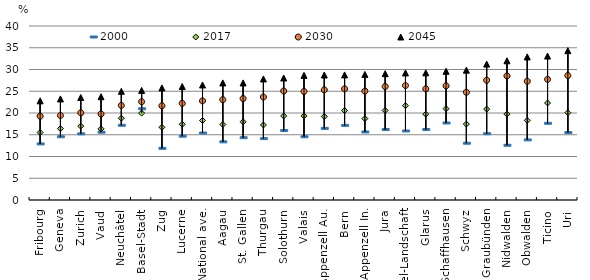
| Category | 2000 | 2017 | 2030 | 2045 |
|---|---|---|---|---|
| Fribourg | 12.892 | 15.514 | 19.264 | 22.798 |
| Geneva | 14.536 | 16.413 | 19.419 | 23.24 |
| Zurich | 15.208 | 16.976 | 20.043 | 23.568 |
| Vaud | 15.588 | 16.363 | 19.773 | 23.746 |
| Neuchâtel | 17.178 | 18.8 | 21.737 | 24.985 |
| Basel-Stadt | 20.969 | 19.978 | 22.603 | 25.197 |
| Zug | 11.878 | 16.716 | 21.668 | 25.767 |
| Lucerne | 14.667 | 17.402 | 22.222 | 26.082 |
| National ave. | 15.397 | 18.274 | 22.787 | 26.439 |
| Aagau | 13.365 | 17.351 | 23.068 | 26.919 |
| St. Gallen | 14.322 | 17.977 | 23.322 | 26.919 |
| Thurgau | 14.108 | 17.255 | 23.668 | 27.827 |
| Solothurn | 15.974 | 19.333 | 25.054 | 28.044 |
| Valais | 14.539 | 19.328 | 24.949 | 28.646 |
| Appenzell Au. | 16.455 | 19.192 | 25.322 | 28.734 |
| Bern | 17.15 | 20.559 | 25.554 | 28.755 |
| Appenzell In. | 15.638 | 18.708 | 25.034 | 28.871 |
| Jura | 16.208 | 20.584 | 26.086 | 29.042 |
| Basel-Landschaft | 15.86 | 21.68 | 26.313 | 29.204 |
| Glarus | 16.201 | 19.72 | 25.548 | 29.238 |
| Schaffhausen | 17.699 | 20.991 | 26.248 | 29.582 |
| Schwyz | 13.053 | 17.447 | 24.766 | 29.848 |
| Graubünden | 15.234 | 20.896 | 27.525 | 31.246 |
| Nidwalden | 12.582 | 19.737 | 28.529 | 32.002 |
| Obwalden | 13.815 | 18.294 | 27.295 | 32.897 |
| Ticino | 17.633 | 22.306 | 27.733 | 33.087 |
| Uri | 15.497 | 20.067 | 28.607 | 34.335 |